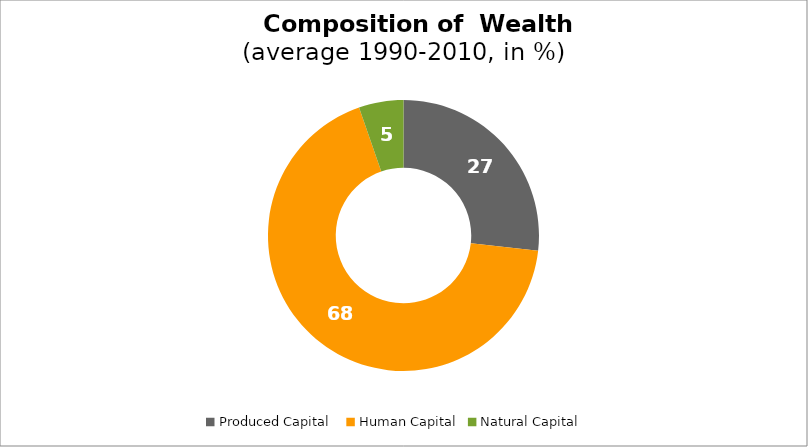
| Category | Series 0 |
|---|---|
| Produced Capital  | 26.809 |
| Human Capital | 67.871 |
| Natural Capital | 5.32 |